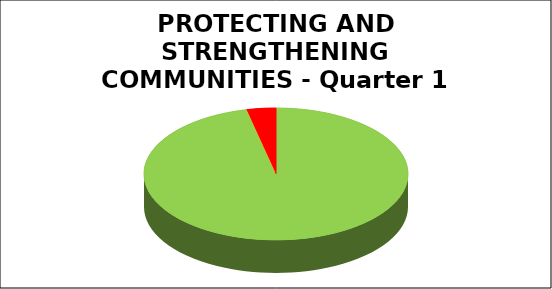
| Category | Series 0 |
|---|---|
| Green | 0.964 |
| Amber | 0 |
| Red | 0.036 |